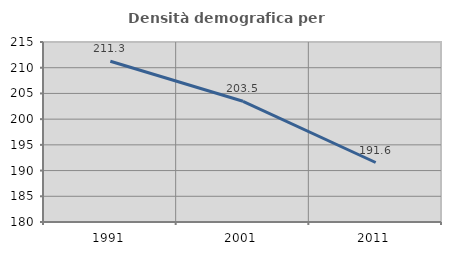
| Category | Densità demografica |
|---|---|
| 1991.0 | 211.263 |
| 2001.0 | 203.475 |
| 2011.0 | 191.569 |